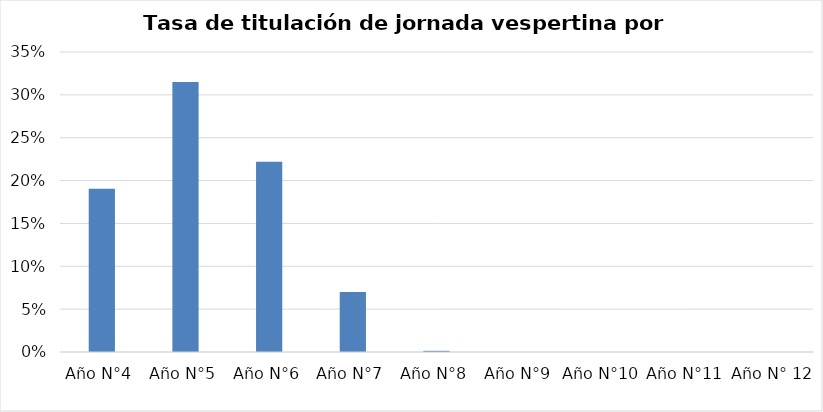
| Category | Series 0 |
|---|---|
| Año N°4 | 0.19 |
| Año N°5 | 0.315 |
| Año N°6 | 0.222 |
| Año N°7 | 0.07 |
| Año N°8 | 0.001 |
| Año N°9 | 0 |
| Año N°10 | 0 |
| Año N°11 | 0 |
| Año N° 12 | 0 |